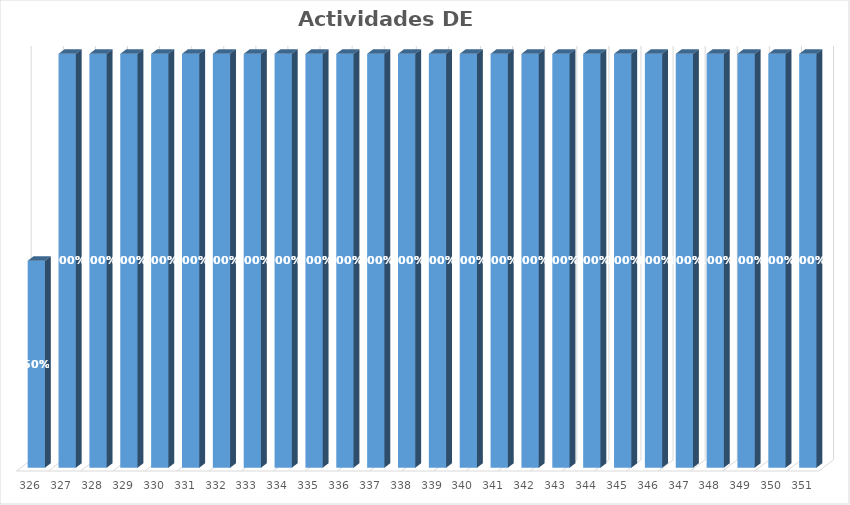
| Category | % Avance |
|---|---|
| 326.0 | 0.5 |
| 327.0 | 1 |
| 328.0 | 1 |
| 329.0 | 1 |
| 330.0 | 1 |
| 331.0 | 1 |
| 332.0 | 1 |
| 333.0 | 1 |
| 334.0 | 1 |
| 335.0 | 1 |
| 336.0 | 1 |
| 337.0 | 1 |
| 338.0 | 1 |
| 339.0 | 1 |
| 340.0 | 1 |
| 341.0 | 1 |
| 342.0 | 1 |
| 343.0 | 1 |
| 344.0 | 1 |
| 345.0 | 1 |
| 346.0 | 1 |
| 347.0 | 1 |
| 348.0 | 1 |
| 349.0 | 1 |
| 350.0 | 1 |
| 351.0 | 1 |